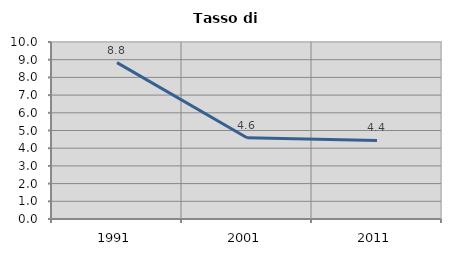
| Category | Tasso di disoccupazione   |
|---|---|
| 1991.0 | 8.835 |
| 2001.0 | 4.587 |
| 2011.0 | 4.438 |